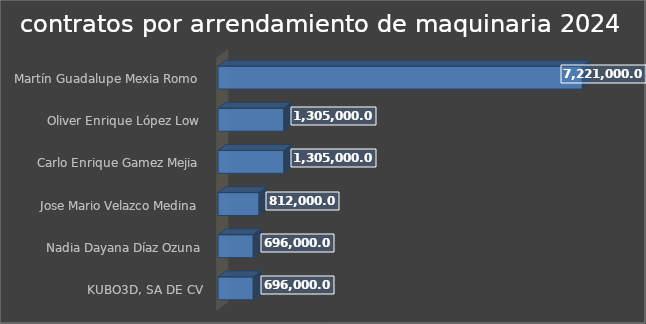
| Category | Costo Anual  |
|---|---|
| KUBO3D, SA DE CV | 696000 |
| Nadia Dayana Díaz Ozuna | 696000 |
| Jose Mario Velazco Medina  | 812000 |
| Carlo Enrique Gamez Mejia  | 1305000 |
| Oliver Enrique López Low  | 1305000 |
| Martín Guadalupe Mexia Romo  | 7221000 |